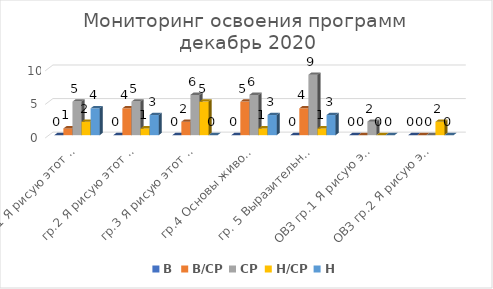
| Category | В | В/СР | СР | Н/СР | Н |
|---|---|---|---|---|---|
| гр.1 Я рисую этот мир 1 | 0 | 1 | 5 | 2 | 4 |
| гр.2 Я рисую этот мир 2 | 0 | 4 | 5 | 1 | 3 |
| гр.3 Я рисую этот мир 3 | 0 | 2 | 6 | 5 | 0 |
| гр.4 Основы живописи и рисунка | 0 | 5 | 6 | 1 | 3 |
| гр. 5 Выразительные возможности живописи и рисунка | 0 | 4 | 9 | 1 | 3 |
| ОВЗ гр.1 Я рисую этот мир | 0 | 0 | 2 | 0 | 0 |
| ОВЗ гр.2 Я рисую этот мир | 0 | 0 | 0 | 2 | 0 |